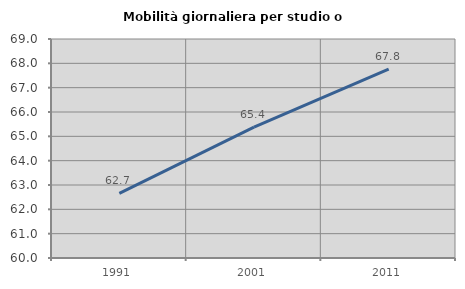
| Category | Mobilità giornaliera per studio o lavoro |
|---|---|
| 1991.0 | 62.654 |
| 2001.0 | 65.38 |
| 2011.0 | 67.76 |